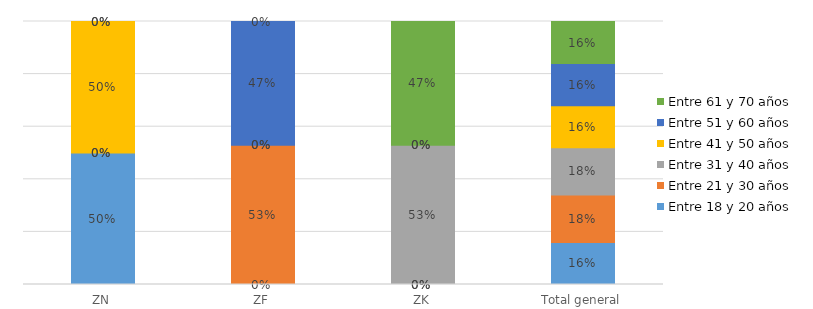
| Category | Entre 18 y 20 años | Entre 21 y 30 años | Entre 31 y 40 años | Entre 41 y 50 años | Entre 51 y 60 años | Entre 61 y 70 años |
|---|---|---|---|---|---|---|
| ZN | 0.5 | 0 | 0 | 0.5 | 0 | 0 |
| ZF | 0 | 0.529 | 0 | 0 | 0.471 | 0 |
| ZK | 0 | 0 | 0.529 | 0 | 0 | 0.471 |
| Total general | 0.16 | 0.18 | 0.18 | 0.16 | 0.16 | 0.16 |